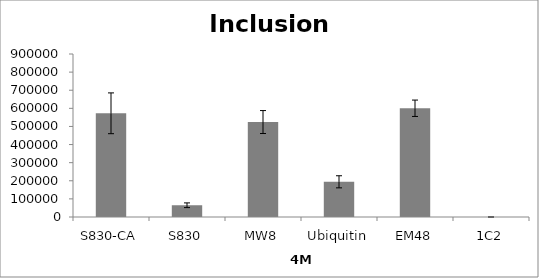
| Category | Series 0 |
|---|---|
| S830-CA | 572563.659 |
| S830 | 64904.084 |
| MW8 | 524286.419 |
| Ubiquitin | 194368.508 |
| EM48 | 600399.331 |
| 1C2 | 0 |